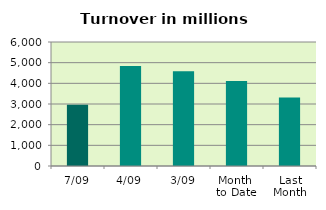
| Category | Series 0 |
|---|---|
| 7/09 | 2966.013 |
| 4/09 | 4835.492 |
| 3/09 | 4589.691 |
| Month 
to Date | 4107.819 |
| Last
Month | 3319.434 |